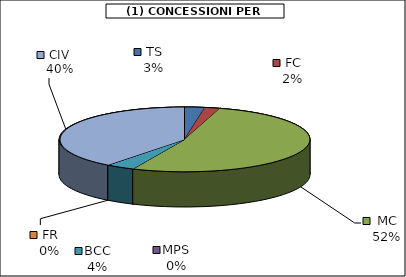
| Category | Series 0 |
|---|---|
| TS | 1405 |
| FC | 1066 |
| MC | 28156 |
| MPS | 0 |
| BCC | 1995 |
| FR | 0 |
| CIV | 21333.5 |